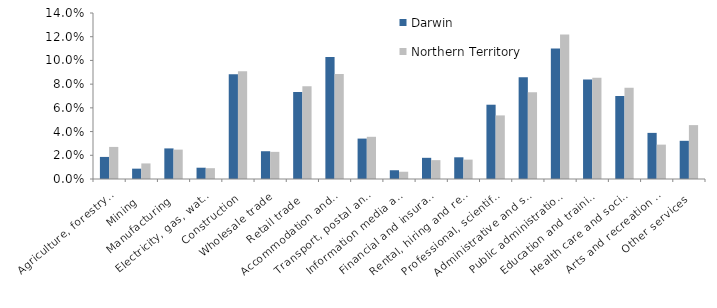
| Category | Darwin | Northern Territory |
|---|---|---|
| Agriculture, forestry and fishing | 0.019 | 0.027 |
| Mining | 0.009 | 0.013 |
| Manufacturing | 0.026 | 0.025 |
| Electricity, gas, water and waste services | 0.01 | 0.009 |
| Construction | 0.088 | 0.091 |
| Wholesale trade | 0.023 | 0.023 |
| Retail trade | 0.073 | 0.078 |
| Accommodation and food services | 0.103 | 0.089 |
| Transport, postal and warehousing | 0.034 | 0.036 |
| Information media and telecommunications | 0.007 | 0.006 |
| Financial and insurance services | 0.018 | 0.016 |
| Rental, hiring and real estate services | 0.018 | 0.016 |
| Professional, scientific and technical services | 0.063 | 0.054 |
| Administrative and support services | 0.086 | 0.073 |
| Public administration and safety | 0.11 | 0.122 |
| Education and training | 0.084 | 0.085 |
| Health care and social assistance | 0.07 | 0.077 |
| Arts and recreation services | 0.039 | 0.029 |
| Other services | 0.032 | 0.045 |